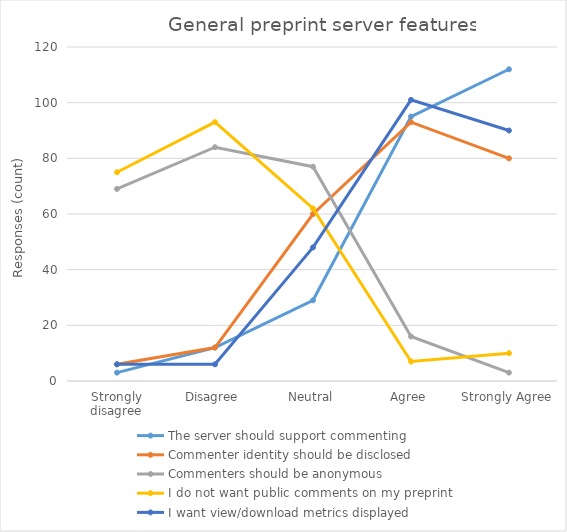
| Category | The server should support commenting | Commenter identity should be disclosed | Commenters should be anonymous | I do not want public comments on my preprint | I want view/download metrics displayed |
|---|---|---|---|---|---|
| Strongly disagree | 3 | 6 | 69 | 75 | 6 |
| Disagree | 12 | 12 | 84 | 93 | 6 |
| Neutral | 29 | 60 | 77 | 62 | 48 |
| Agree | 95 | 93 | 16 | 7 | 101 |
| Strongly Agree | 112 | 80 | 3 | 10 | 90 |